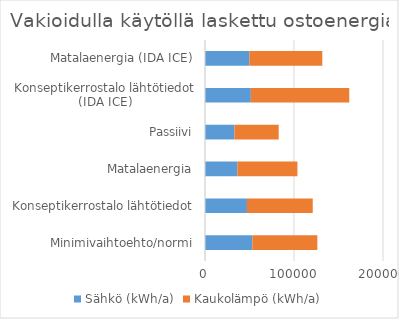
| Category | Sähkö (kWh/a) | Kaukolämpö (kWh/a) |
|---|---|---|
| Minimivaihtoehto/normi | 53188 | 73056 |
| Konseptikerrostalo lähtötiedot | 47155 | 73917 |
| Matalaenergia | 36434 | 67412 |
| Passiivi | 33052 | 49737 |
| Konseptikerrostalo lähtötiedot (IDA ICE) | 51532 | 110558 |
| Matalaenergia (IDA ICE) | 49892 | 81896 |